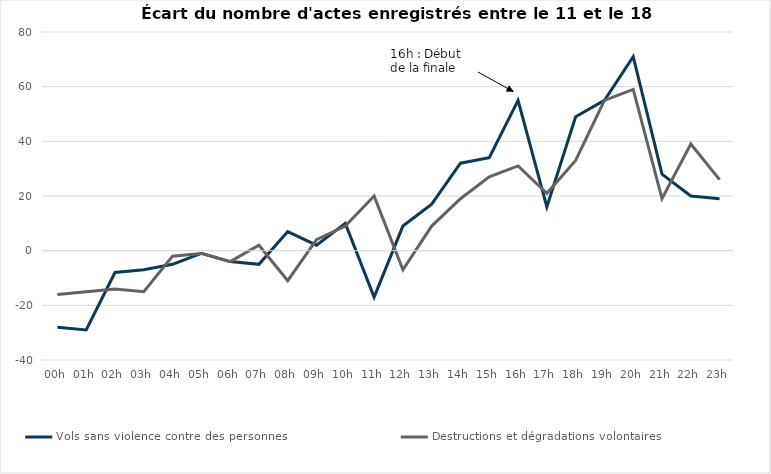
| Category | Vols sans violence contre des personnes  | Destructions et dégradations volontaires  |
|---|---|---|
| 00h | -28 | -16 |
| 01h | -29 | -15 |
| 02h | -8 | -14 |
| 03h | -7 | -15 |
| 04h | -5 | -2 |
| 05h | -1 | -1 |
| 06h | -4 | -4 |
| 07h | -5 | 2 |
| 08h | 7 | -11 |
| 09h | 2 | 4 |
| 10h | 10 | 9 |
| 11h | -17 | 20 |
| 12h | 9 | -7 |
| 13h | 17 | 9 |
| 14h | 32 | 19 |
| 15h | 34 | 27 |
| 16h | 55 | 31 |
| 17h | 16 | 21 |
| 18h | 49 | 33 |
| 19h | 55 | 55 |
| 20h | 71 | 59 |
| 21h | 28 | 19 |
| 22h | 20 | 39 |
| 23h | 19 | 26 |